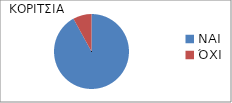
| Category | Series 0 |
|---|---|
| ΝΑΙ | 0.92 |
| ΌΧΙ | 0.08 |